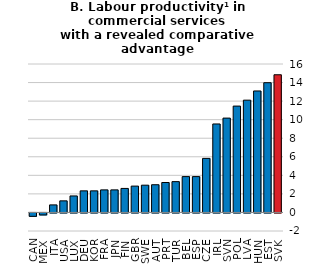
| Category | Commercial services |
|---|---|
| CAN | -0.366 |
| MEX | -0.217 |
| ITA | 0.813 |
| USA | 1.25 |
| LUX | 1.779 |
| DEU | 2.327 |
| KOR | 2.327 |
| FRA | 2.432 |
| JPN | 2.432 |
| FIN | 2.588 |
| GBR | 2.84 |
| SWE | 2.939 |
| AUT | 2.987 |
| PRT | 3.227 |
| TUR | 3.321 |
| BEL | 3.863 |
| ESP | 3.863 |
| CZE | 5.828 |
| IRL | 9.538 |
| SVN | 10.169 |
| POL | 11.465 |
| LVA | 12.102 |
| HUN | 13.095 |
| EST | 13.985 |
| SVK | 14.841 |